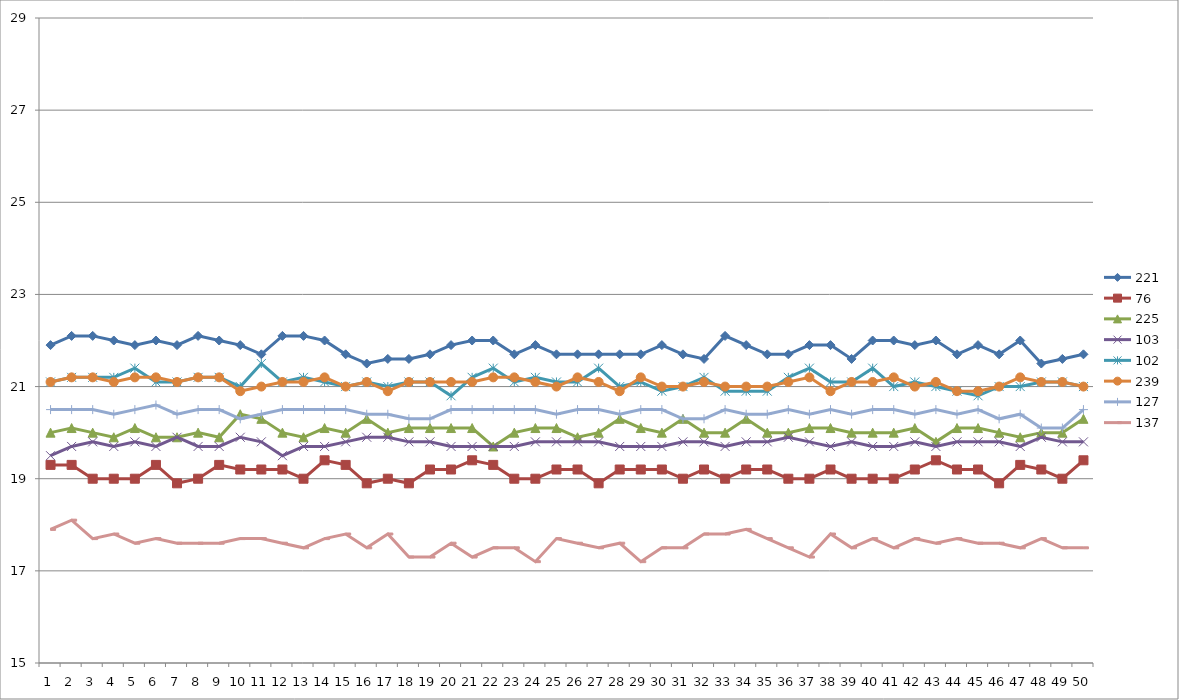
| Category | 221 | 76 | 225 | 103 | 102 | 239 | 127 | 137 |
|---|---|---|---|---|---|---|---|---|
| 0 | 21.9 | 19.3 | 20 | 19.5 | 21.1 | 21.1 | 20.5 | 17.9 |
| 1 | 22.1 | 19.3 | 20.1 | 19.7 | 21.2 | 21.2 | 20.5 | 18.1 |
| 2 | 22.1 | 19 | 20 | 19.8 | 21.2 | 21.2 | 20.5 | 17.7 |
| 3 | 22 | 19 | 19.9 | 19.7 | 21.2 | 21.1 | 20.4 | 17.8 |
| 4 | 21.9 | 19 | 20.1 | 19.8 | 21.4 | 21.2 | 20.5 | 17.6 |
| 5 | 22 | 19.3 | 19.9 | 19.7 | 21.1 | 21.2 | 20.6 | 17.7 |
| 6 | 21.9 | 18.9 | 19.9 | 19.9 | 21.1 | 21.1 | 20.4 | 17.6 |
| 7 | 22.1 | 19 | 20 | 19.7 | 21.2 | 21.2 | 20.5 | 17.6 |
| 8 | 22 | 19.3 | 19.9 | 19.7 | 21.2 | 21.2 | 20.5 | 17.6 |
| 9 | 21.9 | 19.2 | 20.4 | 19.9 | 21 | 20.9 | 20.3 | 17.7 |
| 10 | 21.7 | 19.2 | 20.3 | 19.8 | 21.5 | 21 | 20.4 | 17.7 |
| 11 | 22.1 | 19.2 | 20 | 19.5 | 21.1 | 21.1 | 20.5 | 17.6 |
| 12 | 22.1 | 19 | 19.9 | 19.7 | 21.2 | 21.1 | 20.5 | 17.5 |
| 13 | 22 | 19.4 | 20.1 | 19.7 | 21.1 | 21.2 | 20.5 | 17.7 |
| 14 | 21.7 | 19.3 | 20 | 19.8 | 21 | 21 | 20.5 | 17.8 |
| 15 | 21.5 | 18.9 | 20.3 | 19.9 | 21.1 | 21.1 | 20.4 | 17.5 |
| 16 | 21.6 | 19 | 20 | 19.9 | 21 | 20.9 | 20.4 | 17.8 |
| 17 | 21.6 | 18.9 | 20.1 | 19.8 | 21.1 | 21.1 | 20.3 | 17.3 |
| 18 | 21.7 | 19.2 | 20.1 | 19.8 | 21.1 | 21.1 | 20.3 | 17.3 |
| 19 | 21.9 | 19.2 | 20.1 | 19.7 | 20.8 | 21.1 | 20.5 | 17.6 |
| 20 | 22 | 19.4 | 20.1 | 19.7 | 21.2 | 21.1 | 20.5 | 17.3 |
| 21 | 22 | 19.3 | 19.7 | 19.7 | 21.4 | 21.2 | 20.5 | 17.5 |
| 22 | 21.7 | 19 | 20 | 19.7 | 21.1 | 21.2 | 20.5 | 17.5 |
| 23 | 21.9 | 19 | 20.1 | 19.8 | 21.2 | 21.1 | 20.5 | 17.2 |
| 24 | 21.7 | 19.2 | 20.1 | 19.8 | 21.1 | 21 | 20.4 | 17.7 |
| 25 | 21.7 | 19.2 | 19.9 | 19.8 | 21.1 | 21.2 | 20.5 | 17.6 |
| 26 | 21.7 | 18.9 | 20 | 19.8 | 21.4 | 21.1 | 20.5 | 17.5 |
| 27 | 21.7 | 19.2 | 20.3 | 19.7 | 21 | 20.9 | 20.4 | 17.6 |
| 28 | 21.7 | 19.2 | 20.1 | 19.7 | 21.1 | 21.2 | 20.5 | 17.2 |
| 29 | 21.9 | 19.2 | 20 | 19.7 | 20.9 | 21 | 20.5 | 17.5 |
| 30 | 21.7 | 19 | 20.3 | 19.8 | 21 | 21 | 20.3 | 17.5 |
| 31 | 21.6 | 19.2 | 20 | 19.8 | 21.2 | 21.1 | 20.3 | 17.8 |
| 32 | 22.1 | 19 | 20 | 19.7 | 20.9 | 21 | 20.5 | 17.8 |
| 33 | 21.9 | 19.2 | 20.3 | 19.8 | 20.9 | 21 | 20.4 | 17.9 |
| 34 | 21.7 | 19.2 | 20 | 19.8 | 20.9 | 21 | 20.4 | 17.7 |
| 35 | 21.7 | 19 | 20 | 19.9 | 21.2 | 21.1 | 20.5 | 17.5 |
| 36 | 21.9 | 19 | 20.1 | 19.8 | 21.4 | 21.2 | 20.4 | 17.3 |
| 37 | 21.9 | 19.2 | 20.1 | 19.7 | 21.1 | 20.9 | 20.5 | 17.8 |
| 38 | 21.6 | 19 | 20 | 19.8 | 21.1 | 21.1 | 20.4 | 17.5 |
| 39 | 22 | 19 | 20 | 19.7 | 21.4 | 21.1 | 20.5 | 17.7 |
| 40 | 22 | 19 | 20 | 19.7 | 21 | 21.2 | 20.5 | 17.5 |
| 41 | 21.9 | 19.2 | 20.1 | 19.8 | 21.1 | 21 | 20.4 | 17.7 |
| 42 | 22 | 19.4 | 19.8 | 19.7 | 21 | 21.1 | 20.5 | 17.6 |
| 43 | 21.7 | 19.2 | 20.1 | 19.8 | 20.9 | 20.9 | 20.4 | 17.7 |
| 44 | 21.9 | 19.2 | 20.1 | 19.8 | 20.8 | 20.9 | 20.5 | 17.6 |
| 45 | 21.7 | 18.9 | 20 | 19.8 | 21 | 21 | 20.3 | 17.6 |
| 46 | 22 | 19.3 | 19.9 | 19.7 | 21 | 21.2 | 20.4 | 17.5 |
| 47 | 21.5 | 19.2 | 20 | 19.9 | 21.1 | 21.1 | 20.1 | 17.7 |
| 48 | 21.6 | 19 | 20 | 19.8 | 21.1 | 21.1 | 20.1 | 17.5 |
| 49 | 21.7 | 19.4 | 20.3 | 19.8 | 21 | 21 | 20.5 | 17.5 |